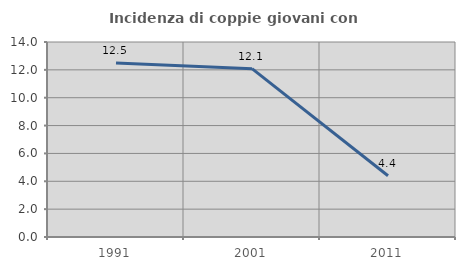
| Category | Incidenza di coppie giovani con figli |
|---|---|
| 1991.0 | 12.5 |
| 2001.0 | 12.088 |
| 2011.0 | 4.396 |